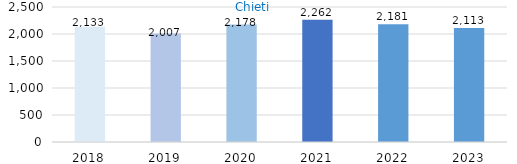
| Category | Series 0 |
|---|---|
| 2018.0 | 2133 |
| 2019.0 | 2007 |
| 2020.0 | 2178 |
| 2021.0 | 2262 |
| 2022.0 | 2181 |
| 2023.0 | 2113 |